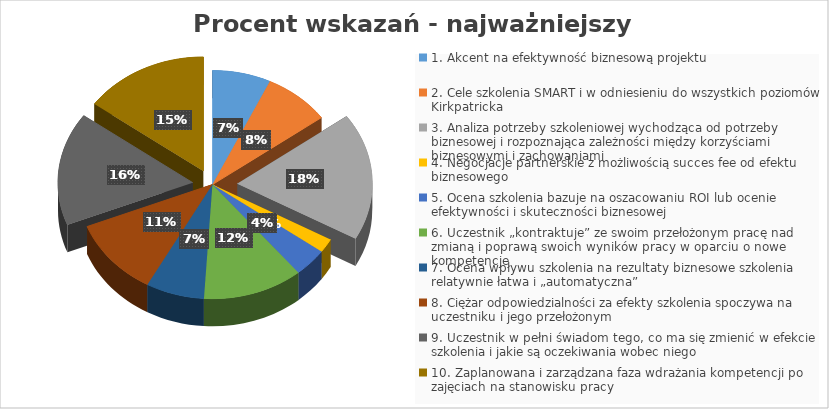
| Category | Series 0 |
|---|---|
| 1. Akcent na efektywność biznesową projektu | 7 |
| 2. Cele szkolenia SMART i w odniesieniu do wszystkich poziomów Kirkpatricka | 8 |
| 3. Analiza potrzeby szkoleniowej wychodząca od potrzeby biznesowej i rozpoznająca zależności między korzyściami biznesowymi i zachowaniami | 18 |
| 4. Negocjacje partnerskie z możliwością succes fee od efektu biznesowego  | 2 |
| 5. Ocena szkolenia bazuje na oszacowaniu ROI lub ocenie efektywności i skuteczności biznesowej | 4 |
| 6. Uczestnik „kontraktuje” ze swoim przełożonym pracę nad zmianą i poprawą swoich wyników pracy w oparciu o nowe kompetencje | 12 |
| 7. Ocena wpływu szkolenia na rezultaty biznesowe szkolenia relatywnie łatwa i „automatyczna” | 7 |
| 8. Ciężar odpowiedzialności za efekty szkolenia spoczywa na uczestniku i jego przełożonym | 11 |
| 9. Uczestnik w pełni świadom tego, co ma się zmienić w efekcie szkolenia i jakie są oczekiwania wobec niego | 16 |
| 10. Zaplanowana i zarządzana faza wdrażania kompetencji po zajęciach na stanowisku pracy | 15 |